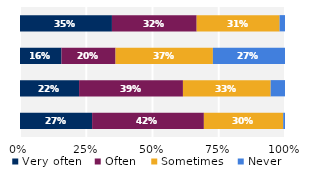
| Category | Very often | Often | Sometimes | Never |
|---|---|---|---|---|
| Talked about students' career plans | 0.347 | 0.32 | 0.313 | 0.02 |
| Worked on activities other than 
coursework | 0.156 | 0.204 | 0.367 | 0.272 |
| Discussed course topics, ideas, or concepts 
outside of class | 0.223 | 0.392 | 0.331 | 0.054 |
| Discussed students' academic performance | 0.272 | 0.422 | 0.299 | 0.007 |